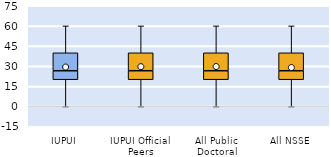
| Category | 25th | 50th | 75th |
|---|---|---|---|
| IUPUI | 20 | 6.667 | 13.333 |
| IUPUI Official Peers | 20 | 6.667 | 13.333 |
| All Public Doctoral | 20 | 6.667 | 13.333 |
| All NSSE | 20 | 6.667 | 13.333 |